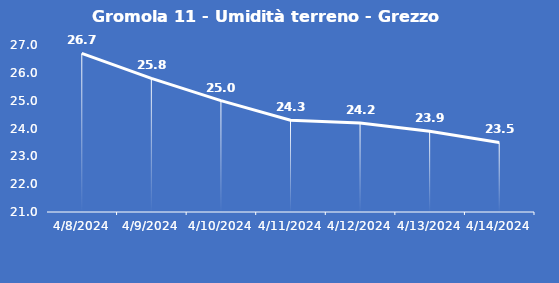
| Category | Gromola 11 - Umidità terreno - Grezzo (%VWC) |
|---|---|
| 4/8/24 | 26.7 |
| 4/9/24 | 25.8 |
| 4/10/24 | 25 |
| 4/11/24 | 24.3 |
| 4/12/24 | 24.2 |
| 4/13/24 | 23.9 |
| 4/14/24 | 23.5 |